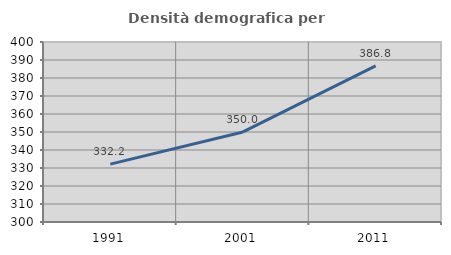
| Category | Densità demografica |
|---|---|
| 1991.0 | 332.175 |
| 2001.0 | 350.044 |
| 2011.0 | 386.775 |